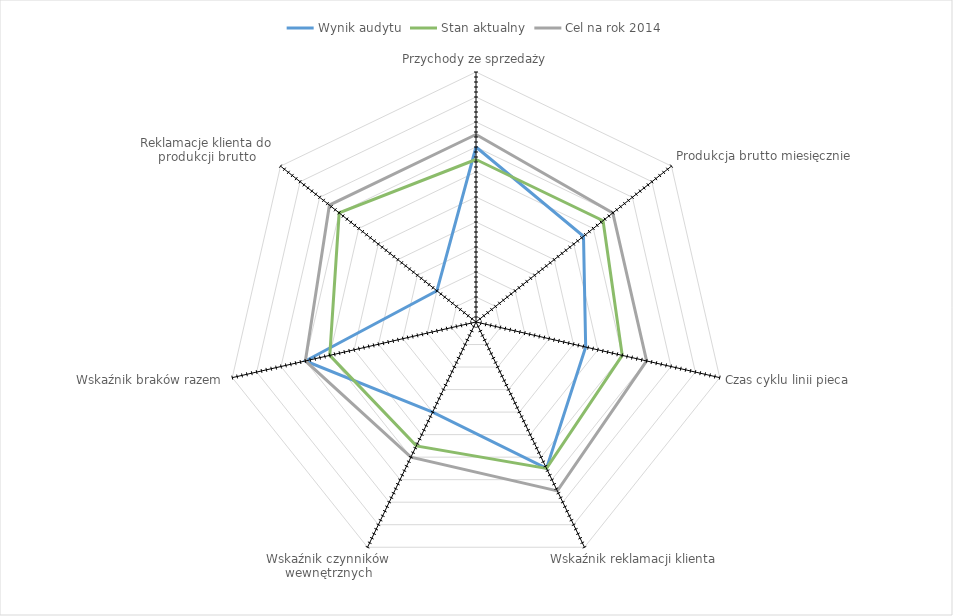
| Category | Wynik audytu | Stan aktualny | Cel na rok 2014 |
|---|---|---|---|
| Przychody ze sprzedaży | 70 | 65 | 75 |
| Produkcja brutto miesięcznie | 55 | 65 | 70 |
| Czas cyklu linii pieca | 45 | 60 | 70 |
| Wskaźnik reklamacji klienta | 65 | 65 | 75 |
| Wskaźnik czynników wewnętrznych | 40 | 55 | 60 |
| Wskaźnik braków razem | 70 | 60 | 70 |
| Reklamacje klienta do produkcji brutto | 20 | 70 | 75 |